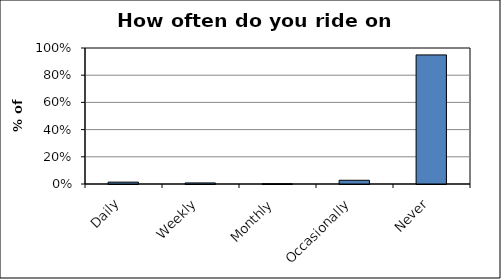
| Category | Series 0 |
|---|---|
| Daily | 0.014 |
| Weekly | 0.008 |
| Monthly | 0.002 |
| Occasionally | 0.027 |
| Never | 0.949 |